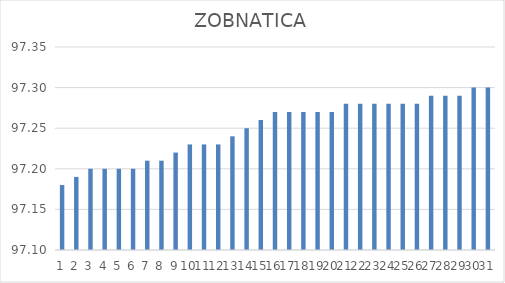
| Category | ZOBNATICA |
|---|---|
| 0 | 97.18 |
| 1 | 97.19 |
| 2 | 97.2 |
| 3 | 97.2 |
| 4 | 97.2 |
| 5 | 97.2 |
| 6 | 97.21 |
| 7 | 97.21 |
| 8 | 97.22 |
| 9 | 97.23 |
| 10 | 97.23 |
| 11 | 97.23 |
| 12 | 97.24 |
| 13 | 97.25 |
| 14 | 97.26 |
| 15 | 97.27 |
| 16 | 97.27 |
| 17 | 97.27 |
| 18 | 97.27 |
| 19 | 97.27 |
| 20 | 97.28 |
| 21 | 97.28 |
| 22 | 97.28 |
| 23 | 97.28 |
| 24 | 97.28 |
| 25 | 97.28 |
| 26 | 97.29 |
| 27 | 97.29 |
| 28 | 97.29 |
| 29 | 97.3 |
| 30 | 97.3 |